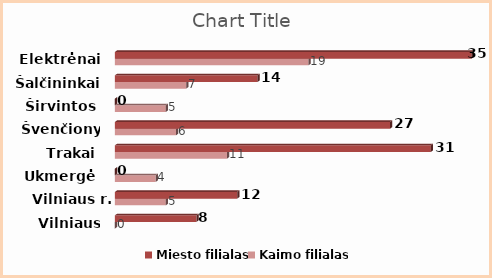
| Category | Miesto filialas | Kaimo filialas |
|---|---|---|
| Elektrėnai | 35 | 19 |
| Šalčininkai | 14 | 7 |
| Širvintos | 0 | 5 |
| Švenčionys | 27 | 6 |
| Trakai | 31 | 11 |
| Ukmergė | 0 | 4 |
| Vilniaus r. | 12 | 5 |
| Vilniaus m. | 8 | 0 |